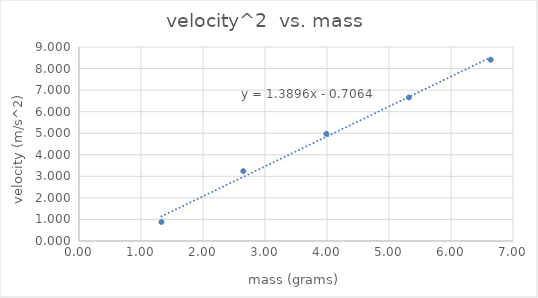
| Category | velocity2 (m/s)2   |
|---|---|
| 1.33 | 0.884 |
| 2.65 | 3.24 |
| 3.99 | 4.973 |
| 5.32 | 6.656 |
| 6.64 | 8.41 |